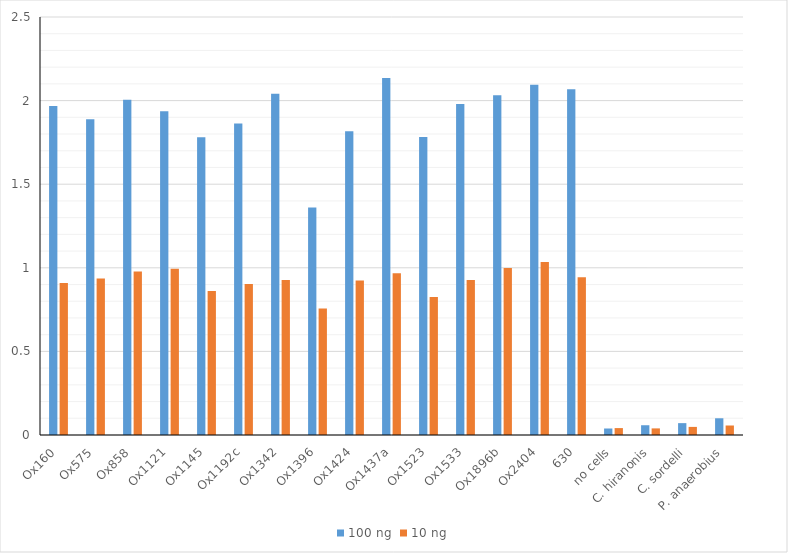
| Category | 100 ng | 10 ng |
|---|---|---|
| Ox160 | 1.967 | 0.91 |
| Ox575 | 1.888 | 0.936 |
| Ox858 | 2.005 | 0.978 |
| Ox1121 | 1.937 | 0.994 |
| Ox1145 | 1.781 | 0.861 |
| Ox1192c | 1.862 | 0.902 |
| Ox1342 | 2.041 | 0.927 |
| Ox1396 | 1.361 | 0.757 |
| Ox1424 | 1.817 | 0.924 |
| Ox1437a | 2.136 | 0.968 |
| Ox1523 | 1.782 | 0.825 |
| Ox1533 | 1.979 | 0.928 |
| Ox1896b | 2.032 | 0.999 |
| Ox2404 | 2.095 | 1.035 |
| 630 | 2.068 | 0.943 |
| no cells | 0.039 | 0.041 |
| C. hiranonis | 0.058 | 0.04 |
| C. sordelli | 0.071 | 0.048 |
| P. anaerobius | 0.1 | 0.057 |